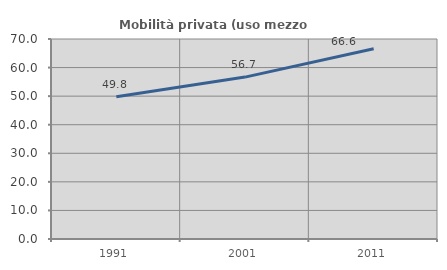
| Category | Mobilità privata (uso mezzo privato) |
|---|---|
| 1991.0 | 49.762 |
| 2001.0 | 56.663 |
| 2011.0 | 66.556 |